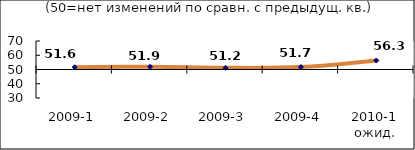
| Category | Диф.индекс ↓ |
|---|---|
| 2009-1 | 51.625 |
| 2009-2 | 51.895 |
| 2009-3 | 51.195 |
| 2009-4 | 51.725 |
| 2010-1 ожид. | 56.32 |